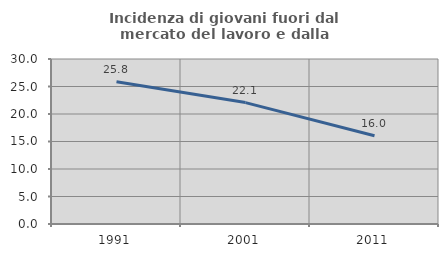
| Category | Incidenza di giovani fuori dal mercato del lavoro e dalla formazione  |
|---|---|
| 1991.0 | 25.849 |
| 2001.0 | 22.073 |
| 2011.0 | 16.049 |